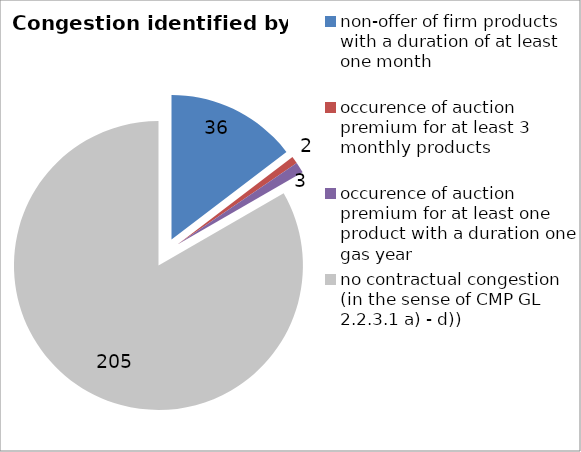
| Category | Series 0 |
|---|---|
| non-offer of firm products with a duration of at least one month | 36 |
| occurence of auction premium for at least 3 monthly products | 2 |
| occurence of auction premium for at least 2 quarterly products | 0 |
| occurence of auction premium for at least one product with a duration one gas year | 3 |
| no contractual congestion
(in the sense of CMP GL 2.2.3.1 a) - d)) | 205 |